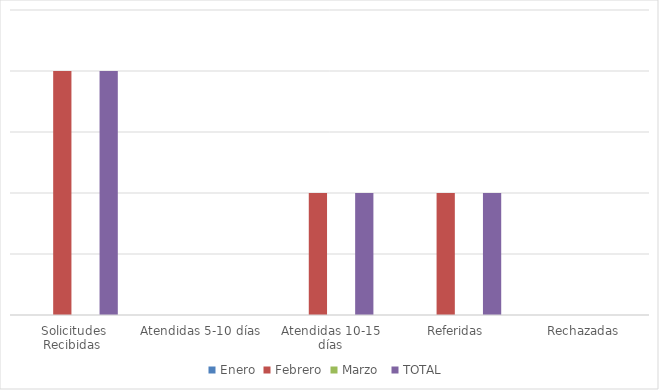
| Category | Enero | Febrero | Marzo  | TOTAL  |
|---|---|---|---|---|
| Solicitudes Recibidas  | 0 | 2 | 0 | 2 |
| Atendidas 5-10 días | 0 | 0 | 0 | 0 |
| Atendidas 10-15 días | 0 | 1 | 0 | 1 |
| Referidas | 0 | 1 | 0 | 1 |
| Rechazadas | 0 | 0 | 0 | 0 |